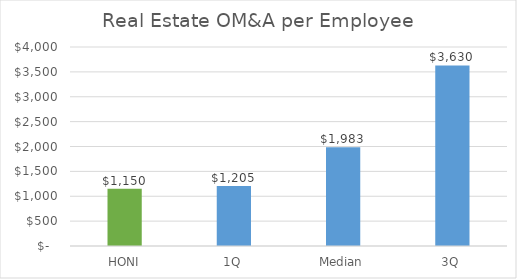
| Category | Real Estate OM&A per Employee |
|---|---|
| HONI | 1149.907 |
| 1Q | 1204.954 |
| Median | 1982.644 |
| 3Q | 3630.445 |